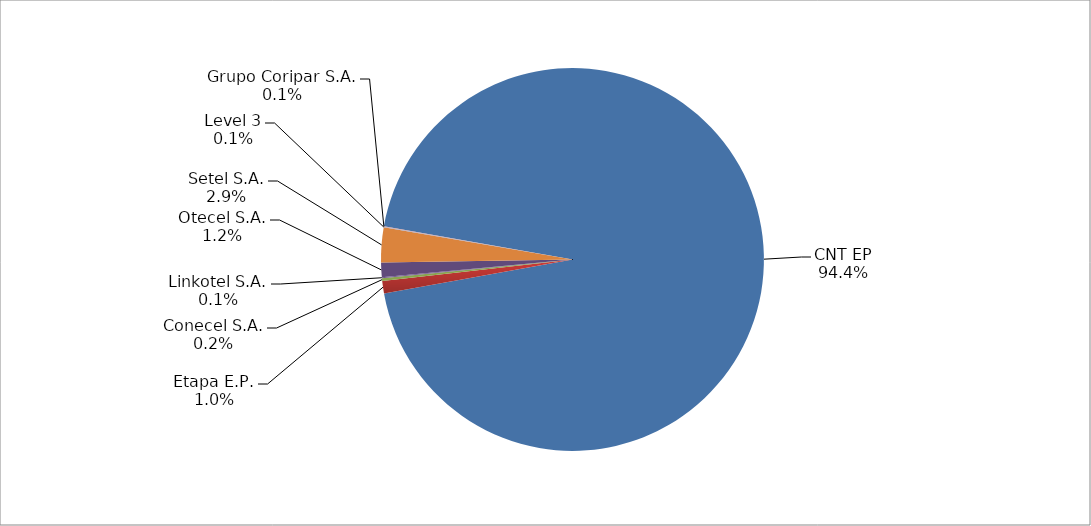
| Category | Series 0 |
|---|---|
| CNT EP | 2087 |
| Etapa E.P. | 23 |
| Conecel S.A. | 5 |
| Linkotel S.A. | 2 |
| Otecel S.A. | 27 |
| Setel S.A. | 65 |
| Level 3 | 1 |
| Grupo Coripar S.A. | 1 |